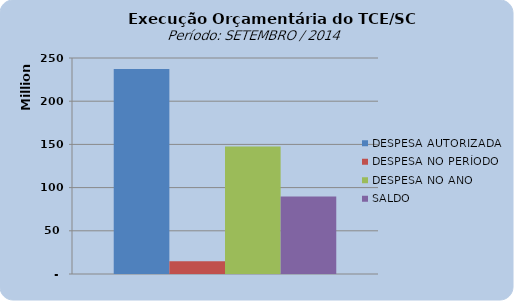
| Category | DESPESA AUTORIZADA | DESPESA NO PERÍODO | DESPESA NO ANO | SALDO |
|---|---|---|---|---|
| 0 | 237249533.5 | 14891826.95 | 147511701.41 | 89737832.09 |